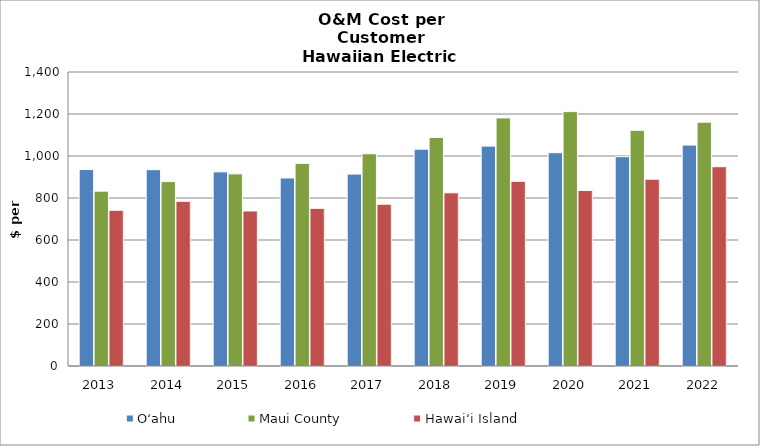
| Category | Oʻahu | Maui County | Hawai‘i Island |
|---|---|---|---|
| 2013.0 | 935.506 | 832.733 | 741.694 |
| 2014.0 | 934.688 | 878.168 | 784.233 |
| 2015.0 | 924.619 | 915.021 | 738.346 |
| 2016.0 | 895.407 | 964.964 | 750.796 |
| 2017.0 | 913.878 | 1010.724 | 770.582 |
| 2018.0 | 1032.485 | 1088.652 | 824.747 |
| 2019.0 | 1047.063 | 1181.389 | 879.468 |
| 2020.0 | 1015.692 | 1211.342 | 836.121 |
| 2021.0 | 996.85 | 1122.474 | 889.73 |
| 2022.0 | 1052 | 1161 | 949 |